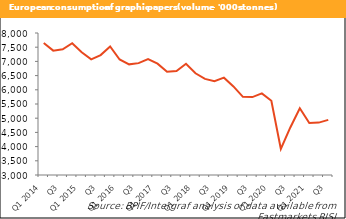
| Category | Series 1 |
|---|---|
| Q1 2014 | 7649 |
| Q2 | 7379 |
| Q3 | 7424 |
| Q4 | 7640 |
| Q1 2015 | 7324 |
| Q2 | 7070 |
| Q3 | 7222 |
| Q4 | 7528 |
| Q1 2016 | 7067 |
| Q2 | 6896 |
| Q3 | 6939 |
| Q4 | 7079 |
| Q1 2017 | 6921 |
| Q2 | 6634 |
| Q3 | 6658 |
| Q4 | 6918 |
| Q1 2018 | 6582 |
| Q2 | 6385 |
| Q3 | 6303 |
| Q4 | 6427 |
| Q1 2019 | 6119 |
| Q2 | 5751 |
| Q3 | 5743 |
| Q4 | 5875 |
| Q1 2020 | 5614 |
| Q2 | 3915 |
| Q3 | 4674 |
| Q4 | 5351 |
| Q1 2021 | 4829 |
| Q2 | 4845 |
| Q3 | 4940 |